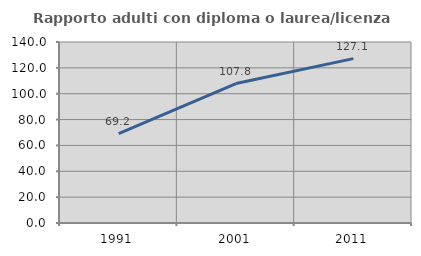
| Category | Rapporto adulti con diploma o laurea/licenza media  |
|---|---|
| 1991.0 | 69.22 |
| 2001.0 | 107.843 |
| 2011.0 | 127.129 |